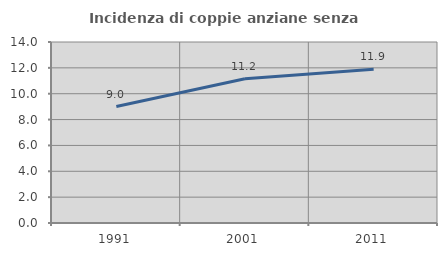
| Category | Incidenza di coppie anziane senza figli  |
|---|---|
| 1991.0 | 9.008 |
| 2001.0 | 11.152 |
| 2011.0 | 11.884 |